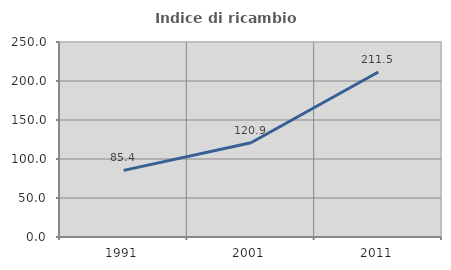
| Category | Indice di ricambio occupazionale  |
|---|---|
| 1991.0 | 85.408 |
| 2001.0 | 120.86 |
| 2011.0 | 211.545 |